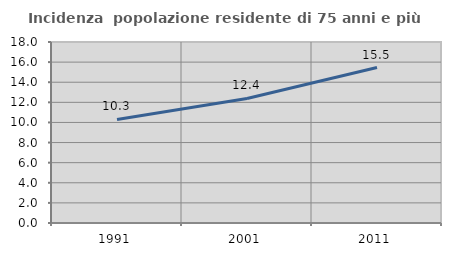
| Category | Incidenza  popolazione residente di 75 anni e più |
|---|---|
| 1991.0 | 10.297 |
| 2001.0 | 12.382 |
| 2011.0 | 15.458 |